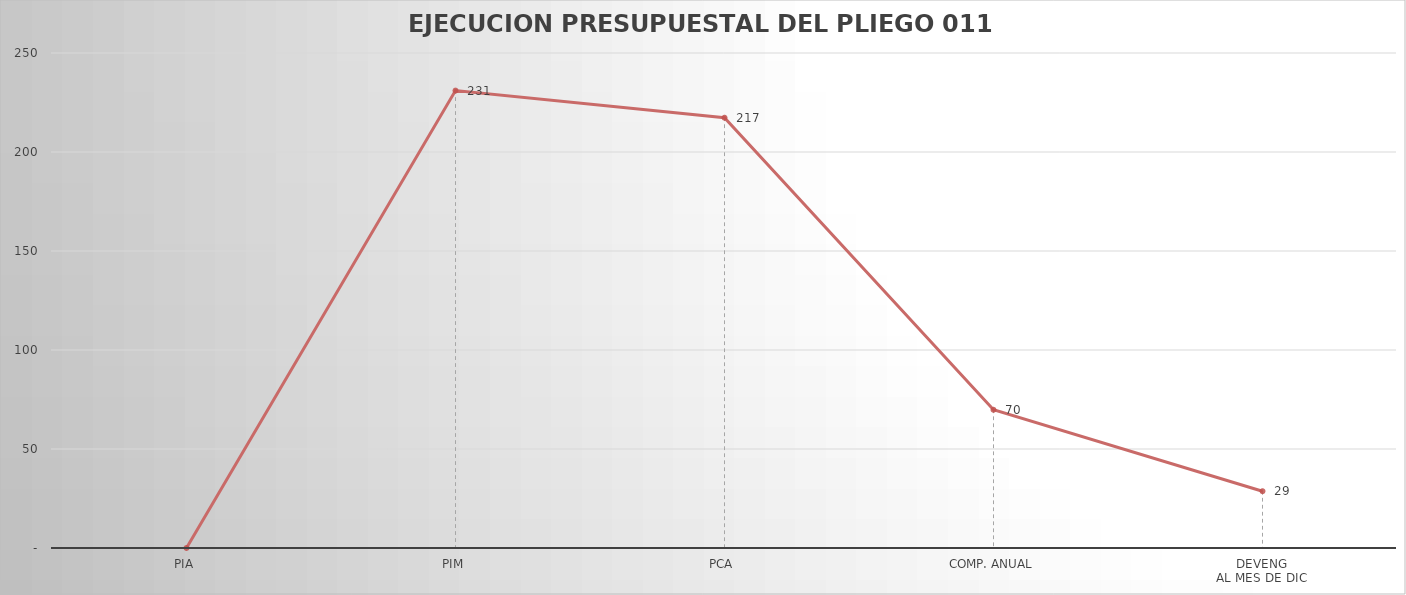
| Category | Series 0 |
|---|---|
| PIA | 0 |
| PIM | 231.03 |
| PCA | 217.318 |
| COMP. ANUAL | 69.816 |
| DEVENG
AL MES DE DIC | 28.674 |